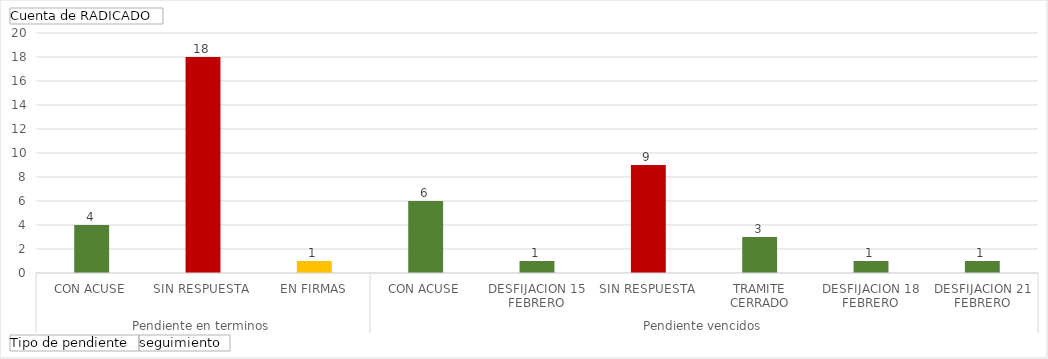
| Category | Total |
|---|---|
| 0 | 4 |
| 1 | 18 |
| 2 | 1 |
| 3 | 6 |
| 4 | 1 |
| 5 | 9 |
| 6 | 3 |
| 7 | 1 |
| 8 | 1 |